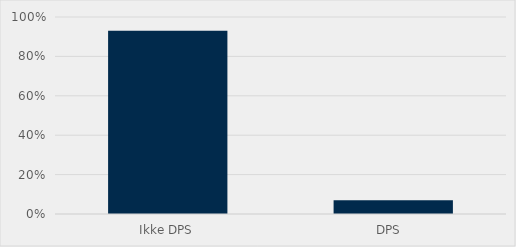
| Category | Prosentvis |
|---|---|
| Ikke DPS | 0.93 |
| DPS   | 0.07 |